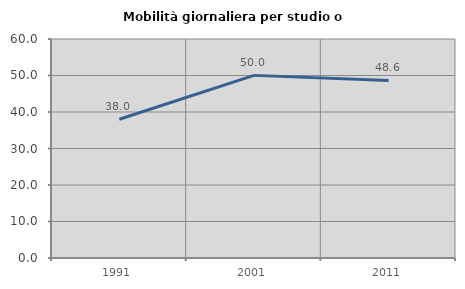
| Category | Mobilità giornaliera per studio o lavoro |
|---|---|
| 1991.0 | 38.001 |
| 2001.0 | 50.034 |
| 2011.0 | 48.649 |